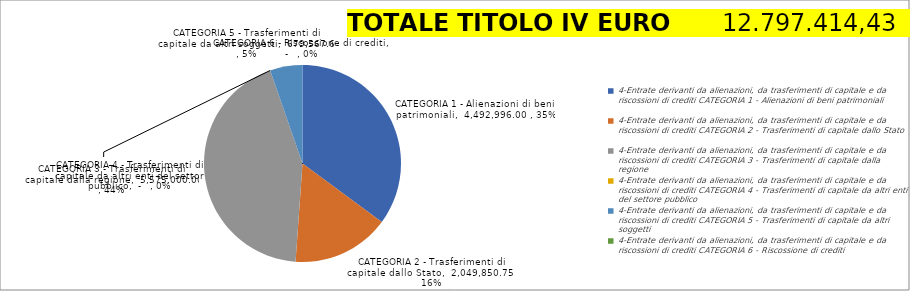
| Category | Series 0 |
|---|---|
| 0 | 4492996 |
| 1 | 2049850.75 |
| 2 | 5575000 |
| 3 | 0 |
| 4 | 679567.68 |
| 5 | 0 |